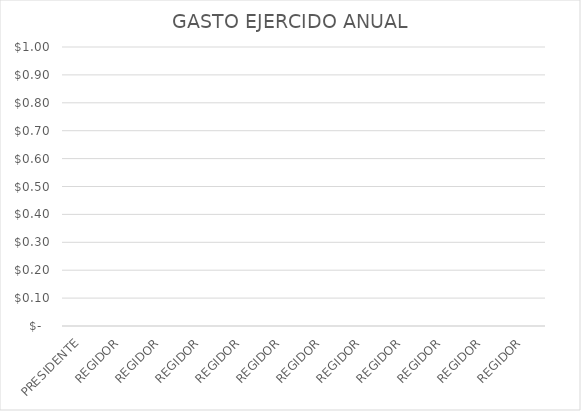
| Category | GASTO EJERCIDO ANUAL |
|---|---|
| PRESIDENTE | 0 |
| REGIDOR | 0 |
| REGIDOR | 0 |
| REGIDOR | 0 |
| REGIDOR | 0 |
| REGIDOR | 0 |
| REGIDOR | 0 |
| REGIDOR | 0 |
| REGIDOR | 0 |
| REGIDOR | 0 |
| REGIDOR | 0 |
| REGIDOR | 0 |